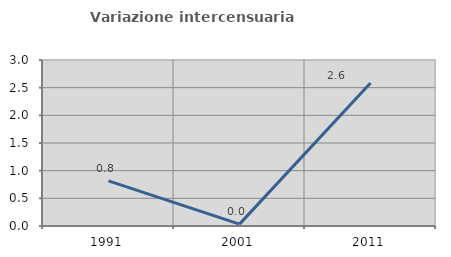
| Category | Variazione intercensuaria annua |
|---|---|
| 1991.0 | 0.815 |
| 2001.0 | 0.034 |
| 2011.0 | 2.585 |